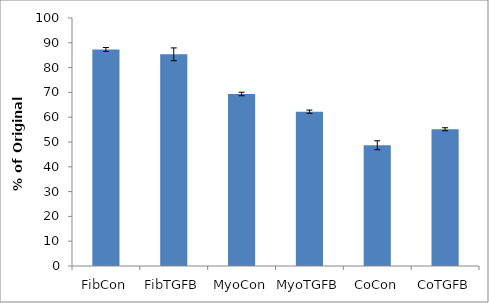
| Category | Series 0 |
|---|---|
| FibCon | 87.316 |
| FibTGFB | 85.363 |
| MyoCon | 69.367 |
| MyoTGFB | 62.219 |
| CoCon | 48.685 |
| CoTGFB | 55.137 |